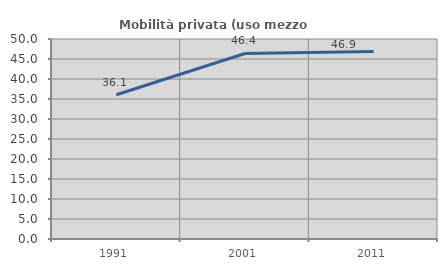
| Category | Mobilità privata (uso mezzo privato) |
|---|---|
| 1991.0 | 36.067 |
| 2001.0 | 46.383 |
| 2011.0 | 46.864 |